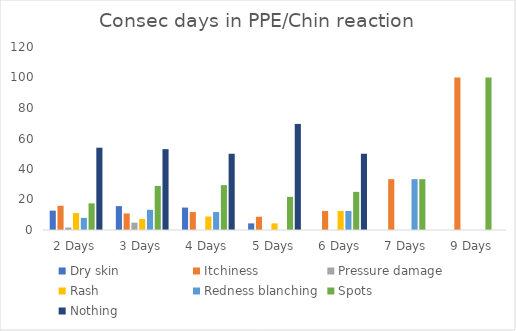
| Category | Dry skin | Itchiness | Pressure damage | Rash | Redness blanching | Spots | Nothing  |
|---|---|---|---|---|---|---|---|
| 2 Days | 12.698 | 15.873 | 1.587 | 11.111 | 7.937 | 17.46 | 53.968 |
| 3 Days | 15.663 | 10.843 | 4.819 | 7.229 | 13.253 | 28.916 | 53.012 |
| 4 Days | 14.706 | 11.765 | 0 | 8.824 | 11.765 | 29.412 | 50 |
| 5 Days | 4.348 | 8.696 | 0 | 4.348 | 0 | 21.739 | 69.565 |
| 6 Days | 0 | 12.5 | 0 | 12.5 | 12.5 | 25 | 50 |
| 7 Days | 0 | 33.333 | 0 | 0 | 33.333 | 33.333 | 0 |
| 9 Days | 0 | 100 | 0 | 0 | 0 | 100 | 0 |